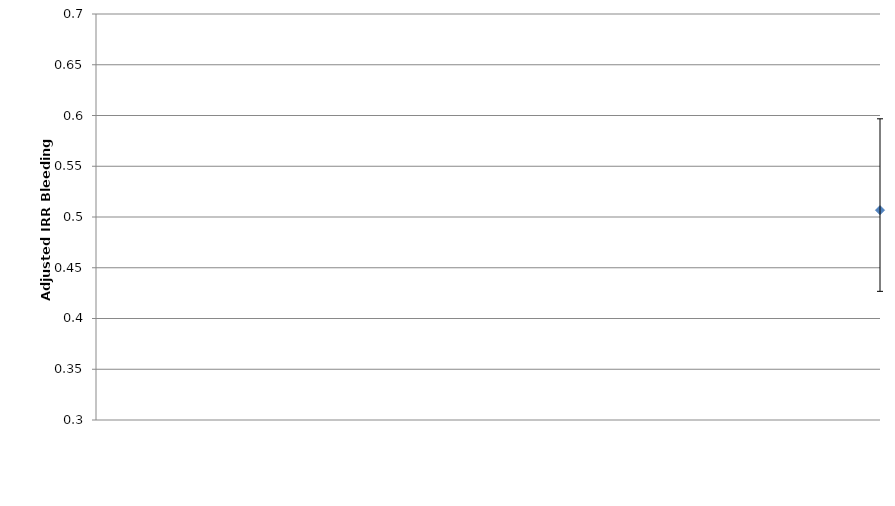
| Category | Series 0 |
|---|---|
| 0 | 0.507 |
| 1 | 0.431 |
| 2 | 0.475 |
| 3 | 0.481 |
| 4 | 0.402 |
| 5 | 0.447 |
| 6 | 0.499 |
| 7 | 0.481 |
| 8 | 0.486 |
| 9 | 0.495 |
| 10 | 0.43 |
| 11 | 0.465 |